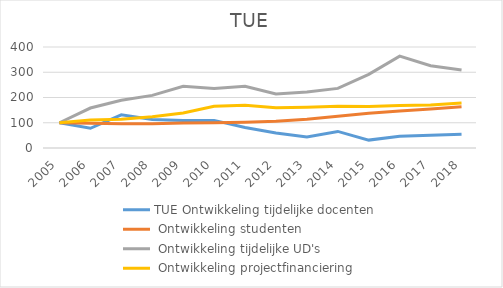
| Category | TUE Ontwikkeling tijdelijke docenten | TUE Ontwikkeling studenten | TUE Ontwikkeling tijdelijke UD's | TUE Ontwikkeling projectfinanciering |
|---|---|---|---|---|
| 2005.0 | 100 | 100 | 100 | 100 |
| 2006.0 | 78.125 | 98.066 | 158.333 | 110.616 |
| 2007.0 | 131.25 | 96.24 | 188.889 | 114.041 |
| 2008.0 | 112.5 | 96.254 | 208.333 | 123.973 |
| 2009.0 | 109.375 | 98.992 | 244.444 | 138.527 |
| 2010.0 | 109.375 | 99.537 | 236.111 | 165.068 |
| 2011.0 | 81.25 | 102.425 | 244.444 | 168.836 |
| 2012.0 | 59.375 | 105.735 | 213.889 | 159.589 |
| 2013.0 | 43.75 | 114.113 | 222.222 | 161.13 |
| 2014.0 | 65.625 | 125.446 | 236.111 | 164.897 |
| 2015.0 | 31.25 | 137.801 | 291.667 | 163.87 |
| 2016.0 | 46.875 | 146.56 | 363.889 | 168.493 |
| 2017.0 | 50.781 | 154.897 | 325.556 | 169.863 |
| 2018.0 | 54 | 163.002 | 309.278 | 177.911 |